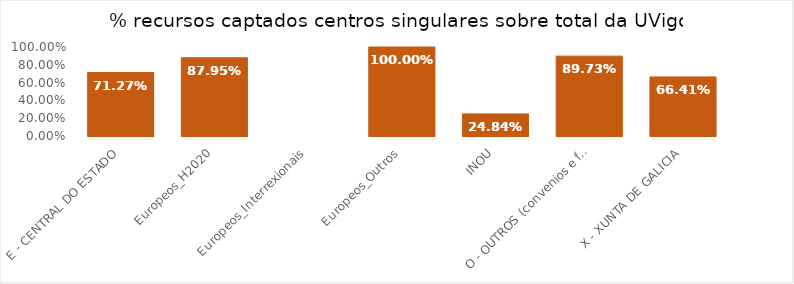
| Category | Series 0 |
|---|---|
| E - CENTRAL DO ESTADO | 0.713 |
| Europeos_H2020 | 0.88 |
| Europeos_Interrexionais | 0 |
| Europeos_Outros | 1 |
| INOU | 0.248 |
| O - OUTROS (convenios e fundacións) | 0.897 |
| X - XUNTA DE GALICIA | 0.664 |